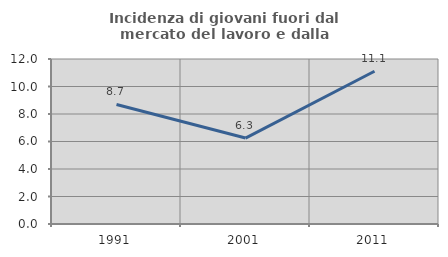
| Category | Incidenza di giovani fuori dal mercato del lavoro e dalla formazione  |
|---|---|
| 1991.0 | 8.696 |
| 2001.0 | 6.25 |
| 2011.0 | 11.111 |